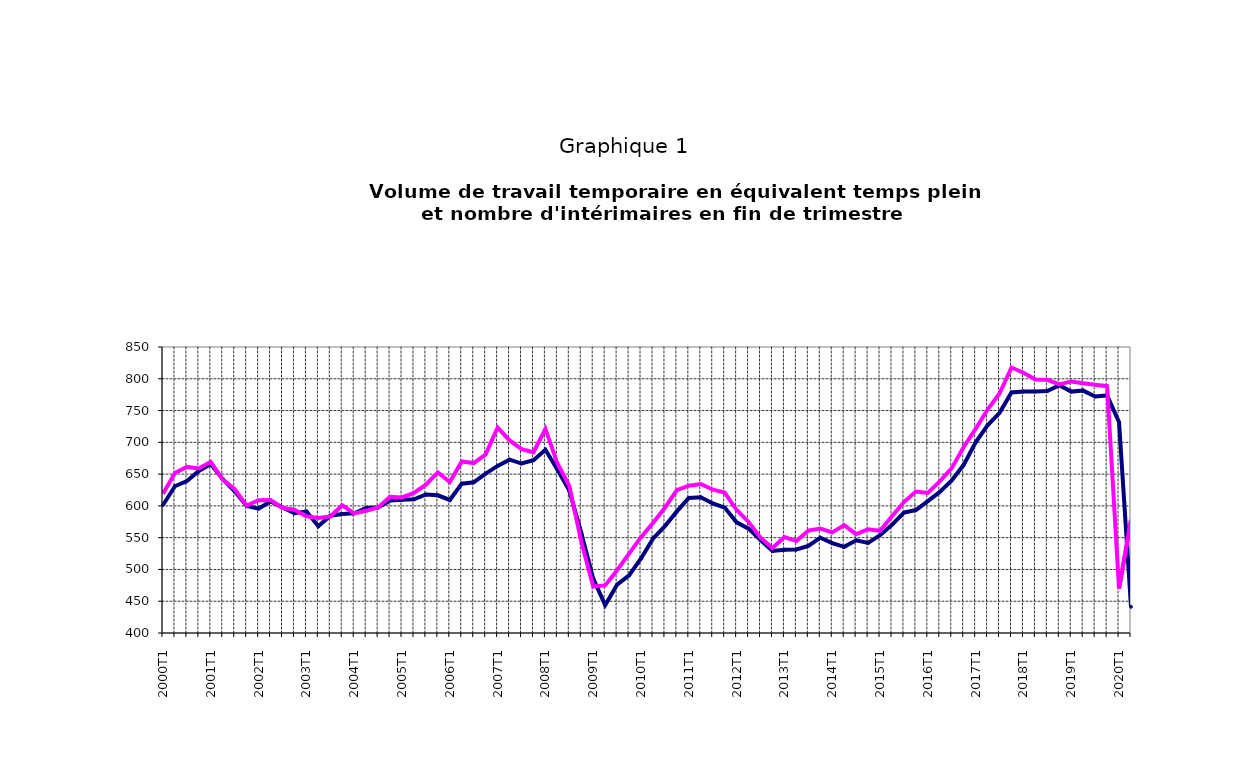
| Category | EETP | int |
|---|---|---|
| 2000T1 | 601.342 | 619.098 |
|      T2 | 630.939 | 651.884 |
|      T3 | 639.063 | 661.327 |
|      T4 | 654.905 | 658.931 |
| 2001T1 | 665.876 | 669.328 |
|      T2 | 642.032 | 641.391 |
|      T3 | 622.87 | 626.182 |
|      T4 | 599.822 | 600.477 |
| 2002T1 | 595.76 | 608.86 |
|      T2 | 606.816 | 609.181 |
|      T3 | 597.353 | 596.727 |
|      T4 | 588.49 | 593.91 |
| 2003T1 | 591.348 | 583.666 |
|      T2 | 568.083 | 580.831 |
|      T3 | 584.508 | 583.192 |
|      T4 | 587.18 | 600.822 |
| 2004T1 | 588.328 | 588.237 |
|      T2 | 596.84 | 592.277 |
|      T3 | 597.506 | 597.649 |
|      T4 | 608.461 | 614.456 |
| 2005T1 | 609.782 | 613.352 |
|      T2 | 610.456 | 620.471 |
|      T3 | 617.922 | 633.285 |
|      T4 | 616.639 | 652.685 |
| 2006T1 | 609.319 | 637.528 |
|      T2 | 634.98 | 669.9 |
|      T3 | 637.109 | 667.375 |
|      T4 | 650.891 | 680.955 |
| 2007T1 | 662.864 | 723.243 |
|      T2 | 672.757 | 702.92 |
|      T3 | 666.641 | 689.387 |
|      T4 | 671.955 | 684.335 |
| 2008T1 | 688.373 | 720.841 |
|      T2 | 657.308 | 667.003 |
|      T3 | 624.024 | 631.418 |
|      T4 | 557.701 | 543.562 |
| 2009T1 | 485.801 | 473.126 |
|      T2 | 443.791 | 474.836 |
|      T3 | 475.996 | 498.78 |
|      T4 | 490.645 | 524.879 |
| 2010T1 | 517.195 | 550.76 |
|      T2 | 548.531 | 572.962 |
|      T3 | 568.249 | 597.1 |
|      T4 | 591.299 | 624.846 |
| 2011T1 | 612.52 | 631.748 |
|      T2 | 613.698 | 634.511 |
|      T3 | 603.892 | 625.57 |
|      T4 | 597.305 | 620.951 |
| 2012T1 | 574.153 | 593.511 |
|      T2 | 564.163 | 574.731 |
| T3 | 546.311 | 550.013 |
| T4 | 529.033 | 533.602 |
| 2013T1 | 531.018 | 550.988 |
| T2 | 531.447 | 544.59 |
| T3 | 536.979 | 561.055 |
| T4 | 549.987 | 564.25 |
| 2014T1 | 541.467 | 558.293 |
| T2 | 535.553 | 569.781 |
| T3 | 545.859 | 555.516 |
| T4 | 541.711 | 563.261 |
| 2015T1 | 553.941 | 560.869 |
| T2 | 570.179 | 583.703 |
| T3 | 589.372 | 606.014 |
| T4 | 593.411 | 622.557 |
| 2016T1 | 607.568 | 620.356 |
| T2 | 621.925 | 638.644 |
| T3 | 640.171 | 659.365 |
| T4 | 664.592 | 692.632 |
| 2017T1 | 699.895 | 721.175 |
| T2 | 726.816 | 751.617 |
| T3 | 746.423 | 776.836 |
| T4 | 778.388 | 817.754 |
| 2018T1 | 780.147 | 809.603 |
| T2 | 779.882 | 798.896 |
| T3 | 780.836 | 798.39 |
| T4 | 789.85 | 791.063 |
| 2019T1 | 779.826 | 795.829 |
| T2 | 781.396 | 793.119 |
| T3 | 772.219 | 790.454 |
| T4 | 773.757 | 788.363 |
| 2020T1 | 731.651 | 469.749 |
| T2 | 441.29 | 577.834 |